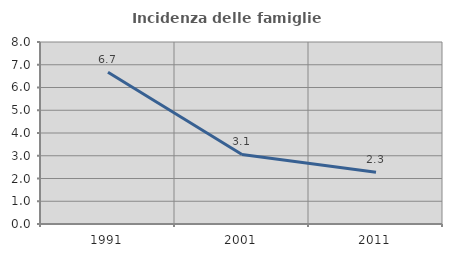
| Category | Incidenza delle famiglie numerose |
|---|---|
| 1991.0 | 6.667 |
| 2001.0 | 3.058 |
| 2011.0 | 2.273 |